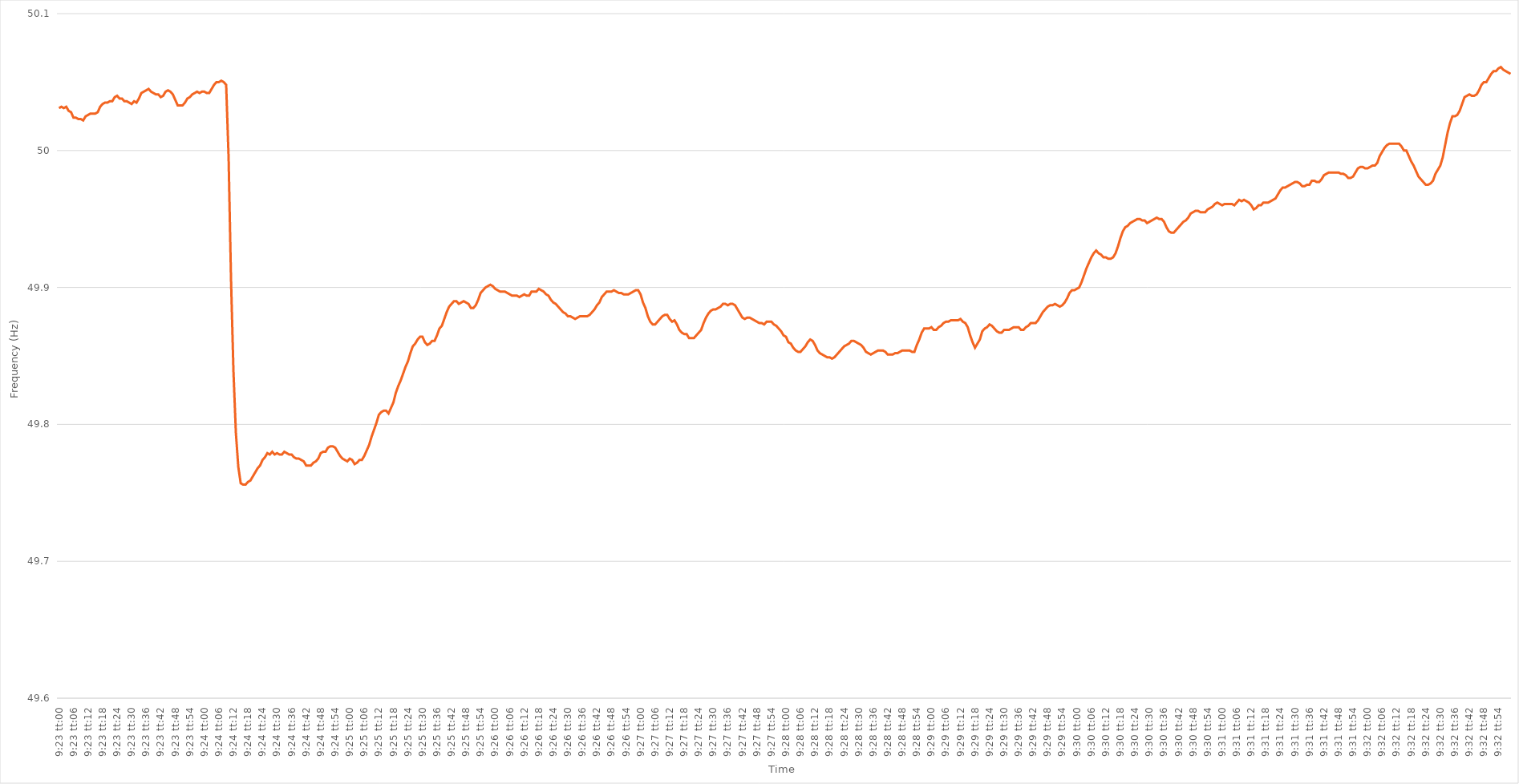
| Category | Series 0 |
|---|---|
| 0.3909722222222222 | 50.031 |
| 0.3909837962962963 | 50.032 |
| 0.39099537037037035 | 50.031 |
| 0.39100694444444445 | 50.032 |
| 0.3910185185185185 | 50.029 |
| 0.39103009259259264 | 50.028 |
| 0.3910416666666667 | 50.024 |
| 0.39105324074074077 | 50.024 |
| 0.3910648148148148 | 50.023 |
| 0.3910763888888889 | 50.023 |
| 0.39108796296296294 | 50.022 |
| 0.391099537037037 | 50.025 |
| 0.39111111111111113 | 50.026 |
| 0.39112268518518517 | 50.027 |
| 0.39113425925925926 | 50.027 |
| 0.3911458333333333 | 50.027 |
| 0.3911574074074074 | 50.028 |
| 0.39116898148148144 | 50.032 |
| 0.3911805555555556 | 50.034 |
| 0.3911921296296296 | 50.035 |
| 0.3912037037037037 | 50.035 |
| 0.39121527777777776 | 50.036 |
| 0.39122685185185185 | 50.036 |
| 0.3912384259259259 | 50.039 |
| 0.39125000000000004 | 50.04 |
| 0.3912615740740741 | 50.038 |
| 0.3912731481481482 | 50.038 |
| 0.3912847222222222 | 50.036 |
| 0.3912962962962963 | 50.036 |
| 0.39130787037037035 | 50.035 |
| 0.3913194444444445 | 50.034 |
| 0.39133101851851854 | 50.036 |
| 0.39134259259259263 | 50.035 |
| 0.39135416666666667 | 50.038 |
| 0.3913657407407407 | 50.042 |
| 0.3913773148148148 | 50.043 |
| 0.39138888888888884 | 50.044 |
| 0.391400462962963 | 50.045 |
| 0.39141203703703703 | 50.043 |
| 0.3914236111111111 | 50.042 |
| 0.39143518518518516 | 50.041 |
| 0.39144675925925926 | 50.041 |
| 0.3914583333333333 | 50.039 |
| 0.39146990740740745 | 50.04 |
| 0.3914814814814815 | 50.043 |
| 0.3914930555555556 | 50.044 |
| 0.3915046296296296 | 50.043 |
| 0.3915162037037037 | 50.041 |
| 0.39152777777777775 | 50.037 |
| 0.3915393518518519 | 50.033 |
| 0.39155092592592594 | 50.033 |
| 0.39156250000000004 | 50.033 |
| 0.3915740740740741 | 50.035 |
| 0.3915856481481481 | 50.038 |
| 0.3915972222222222 | 50.039 |
| 0.39160879629629625 | 50.041 |
| 0.3916203703703704 | 50.042 |
| 0.39163194444444444 | 50.043 |
| 0.39164351851851853 | 50.042 |
| 0.39165509259259257 | 50.043 |
| 0.39166666666666666 | 50.043 |
| 0.3916782407407407 | 50.042 |
| 0.39168981481481485 | 50.042 |
| 0.3917013888888889 | 50.045 |
| 0.391712962962963 | 50.048 |
| 0.391724537037037 | 50.05 |
| 0.3917361111111111 | 50.05 |
| 0.39174768518518516 | 50.051 |
| 0.3917592592592593 | 50.05 |
| 0.39177083333333335 | 50.048 |
| 0.39178240740740744 | 49.995 |
| 0.3917939814814815 | 49.906 |
| 0.3918055555555555 | 49.839 |
| 0.3918171296296296 | 49.794 |
| 0.39182870370370365 | 49.769 |
| 0.3918402777777778 | 49.757 |
| 0.39185185185185184 | 49.756 |
| 0.39186342592592593 | 49.756 |
| 0.391875 | 49.758 |
| 0.39188657407407407 | 49.759 |
| 0.3918981481481481 | 49.762 |
| 0.39190972222222226 | 49.765 |
| 0.3919212962962963 | 49.768 |
| 0.3919328703703704 | 49.77 |
| 0.39194444444444443 | 49.774 |
| 0.3919560185185185 | 49.776 |
| 0.39196759259259256 | 49.779 |
| 0.3919791666666667 | 49.778 |
| 0.39199074074074075 | 49.78 |
| 0.39200231481481485 | 49.778 |
| 0.3920138888888889 | 49.779 |
| 0.392025462962963 | 49.778 |
| 0.392037037037037 | 49.778 |
| 0.39204861111111117 | 49.78 |
| 0.3920601851851852 | 49.779 |
| 0.39207175925925924 | 49.778 |
| 0.39208333333333334 | 49.778 |
| 0.3920949074074074 | 49.776 |
| 0.3921064814814815 | 49.775 |
| 0.3921180555555555 | 49.775 |
| 0.39212962962962966 | 49.774 |
| 0.3921412037037037 | 49.773 |
| 0.3921527777777778 | 49.77 |
| 0.39216435185185183 | 49.77 |
| 0.39217592592592593 | 49.77 |
| 0.39218749999999997 | 49.772 |
| 0.3921990740740741 | 49.773 |
| 0.39221064814814816 | 49.775 |
| 0.39222222222222225 | 49.779 |
| 0.3922337962962963 | 49.78 |
| 0.3922453703703704 | 49.78 |
| 0.3922569444444444 | 49.783 |
| 0.39226851851851857 | 49.784 |
| 0.3922800925925926 | 49.784 |
| 0.39229166666666665 | 49.783 |
| 0.39230324074074074 | 49.78 |
| 0.3923148148148148 | 49.777 |
| 0.3923263888888889 | 49.775 |
| 0.3923379629629629 | 49.774 |
| 0.39234953703703707 | 49.773 |
| 0.3923611111111111 | 49.775 |
| 0.3923726851851852 | 49.774 |
| 0.39238425925925924 | 49.771 |
| 0.39239583333333333 | 49.772 |
| 0.39240740740740737 | 49.774 |
| 0.3924189814814815 | 49.774 |
| 0.39243055555555556 | 49.777 |
| 0.39244212962962965 | 49.781 |
| 0.3924537037037037 | 49.785 |
| 0.3924652777777778 | 49.791 |
| 0.3924768518518518 | 49.796 |
| 0.392488425925926 | 49.801 |
| 0.3925 | 49.807 |
| 0.39251157407407405 | 49.809 |
| 0.39252314814814815 | 49.81 |
| 0.3925347222222222 | 49.81 |
| 0.3925462962962963 | 49.808 |
| 0.3925578703703703 | 49.812 |
| 0.39256944444444447 | 49.816 |
| 0.3925810185185185 | 49.823 |
| 0.3925925925925926 | 49.828 |
| 0.39260416666666664 | 49.832 |
| 0.39261574074074074 | 49.837 |
| 0.3926273148148148 | 49.842 |
| 0.3926388888888889 | 49.846 |
| 0.39265046296296297 | 49.852 |
| 0.39266203703703706 | 49.857 |
| 0.3926736111111111 | 49.859 |
| 0.3926851851851852 | 49.862 |
| 0.39269675925925923 | 49.864 |
| 0.3927083333333334 | 49.864 |
| 0.3927199074074074 | 49.86 |
| 0.3927314814814815 | 49.858 |
| 0.39274305555555555 | 49.859 |
| 0.39275462962962965 | 49.861 |
| 0.3927662037037037 | 49.861 |
| 0.3927777777777777 | 49.865 |
| 0.3927893518518519 | 49.87 |
| 0.3928009259259259 | 49.872 |
| 0.3928125 | 49.877 |
| 0.39282407407407405 | 49.882 |
| 0.39283564814814814 | 49.886 |
| 0.3928472222222222 | 49.888 |
| 0.39285879629629633 | 49.89 |
| 0.39287037037037037 | 49.89 |
| 0.39288194444444446 | 49.888 |
| 0.3928935185185185 | 49.889 |
| 0.3929050925925926 | 49.89 |
| 0.39291666666666664 | 49.889 |
| 0.3929282407407408 | 49.888 |
| 0.3929398148148148 | 49.885 |
| 0.3929513888888889 | 49.885 |
| 0.39296296296296296 | 49.887 |
| 0.39297453703703705 | 49.891 |
| 0.3929861111111111 | 49.896 |
| 0.39299768518518513 | 49.898 |
| 0.3930092592592593 | 49.9 |
| 0.3930208333333333 | 49.901 |
| 0.3930324074074074 | 49.902 |
| 0.39304398148148145 | 49.901 |
| 0.39305555555555555 | 49.899 |
| 0.3930671296296296 | 49.898 |
| 0.39307870370370374 | 49.897 |
| 0.3930902777777778 | 49.897 |
| 0.39310185185185187 | 49.897 |
| 0.3931134259259259 | 49.896 |
| 0.393125 | 49.895 |
| 0.39313657407407404 | 49.894 |
| 0.3931481481481482 | 49.894 |
| 0.39315972222222223 | 49.894 |
| 0.3931712962962963 | 49.893 |
| 0.39318287037037036 | 49.894 |
| 0.39319444444444446 | 49.895 |
| 0.3932060185185185 | 49.894 |
| 0.39321759259259265 | 49.894 |
| 0.3932291666666667 | 49.897 |
| 0.3932407407407407 | 49.897 |
| 0.3932523148148148 | 49.897 |
| 0.39326388888888886 | 49.899 |
| 0.39327546296296295 | 49.898 |
| 0.393287037037037 | 49.897 |
| 0.39329861111111114 | 49.895 |
| 0.3933101851851852 | 49.894 |
| 0.3933217592592593 | 49.891 |
| 0.3933333333333333 | 49.889 |
| 0.3933449074074074 | 49.888 |
| 0.39335648148148145 | 49.886 |
| 0.3933680555555556 | 49.884 |
| 0.39337962962962963 | 49.882 |
| 0.39339120370370373 | 49.881 |
| 0.39340277777777777 | 49.879 |
| 0.39341435185185186 | 49.879 |
| 0.3934259259259259 | 49.878 |
| 0.39343750000000005 | 49.877 |
| 0.3934490740740741 | 49.878 |
| 0.3934606481481482 | 49.879 |
| 0.3934722222222222 | 49.879 |
| 0.39348379629629626 | 49.879 |
| 0.39349537037037036 | 49.879 |
| 0.3935069444444444 | 49.88 |
| 0.39351851851851855 | 49.882 |
| 0.3935300925925926 | 49.884 |
| 0.3935416666666667 | 49.887 |
| 0.3935532407407407 | 49.889 |
| 0.3935648148148148 | 49.893 |
| 0.39357638888888885 | 49.895 |
| 0.393587962962963 | 49.897 |
| 0.39359953703703704 | 49.897 |
| 0.39361111111111113 | 49.897 |
| 0.3936226851851852 | 49.898 |
| 0.39363425925925927 | 49.897 |
| 0.3936458333333333 | 49.896 |
| 0.39365740740740746 | 49.896 |
| 0.3936689814814815 | 49.895 |
| 0.3936805555555556 | 49.895 |
| 0.39369212962962963 | 49.895 |
| 0.39370370370370367 | 49.896 |
| 0.39371527777777776 | 49.897 |
| 0.3937268518518518 | 49.898 |
| 0.39373842592592595 | 49.898 |
| 0.39375 | 49.895 |
| 0.3937615740740741 | 49.889 |
| 0.3937731481481481 | 49.885 |
| 0.3937847222222222 | 49.879 |
| 0.39379629629629626 | 49.875 |
| 0.3938078703703704 | 49.873 |
| 0.39381944444444444 | 49.873 |
| 0.39383101851851854 | 49.875 |
| 0.3938425925925926 | 49.877 |
| 0.39385416666666667 | 49.879 |
| 0.3938657407407407 | 49.88 |
| 0.39387731481481486 | 49.88 |
| 0.3938888888888889 | 49.877 |
| 0.393900462962963 | 49.875 |
| 0.39391203703703703 | 49.876 |
| 0.3939236111111111 | 49.873 |
| 0.39393518518518517 | 49.869 |
| 0.3939467592592593 | 49.867 |
| 0.39395833333333335 | 49.866 |
| 0.3939699074074074 | 49.866 |
| 0.3939814814814815 | 49.863 |
| 0.3939930555555555 | 49.863 |
| 0.3940046296296296 | 49.863 |
| 0.39401620370370366 | 49.865 |
| 0.3940277777777778 | 49.867 |
| 0.39403935185185185 | 49.869 |
| 0.39405092592592594 | 49.874 |
| 0.3940625 | 49.878 |
| 0.3940740740740741 | 49.881 |
| 0.3940856481481481 | 49.883 |
| 0.39409722222222227 | 49.884 |
| 0.3941087962962963 | 49.884 |
| 0.3941203703703704 | 49.885 |
| 0.39413194444444444 | 49.886 |
| 0.39414351851851853 | 49.888 |
| 0.39415509259259257 | 49.888 |
| 0.3941666666666667 | 49.887 |
| 0.39417824074074076 | 49.888 |
| 0.3941898148148148 | 49.888 |
| 0.3942013888888889 | 49.887 |
| 0.39421296296296293 | 49.884 |
| 0.394224537037037 | 49.881 |
| 0.39423611111111106 | 49.878 |
| 0.3942476851851852 | 49.877 |
| 0.39425925925925925 | 49.878 |
| 0.39427083333333335 | 49.878 |
| 0.3942824074074074 | 49.877 |
| 0.3942939814814815 | 49.876 |
| 0.3943055555555555 | 49.875 |
| 0.39431712962962967 | 49.874 |
| 0.3943287037037037 | 49.874 |
| 0.3943402777777778 | 49.873 |
| 0.39435185185185184 | 49.875 |
| 0.39436342592592594 | 49.875 |
| 0.394375 | 49.875 |
| 0.3943865740740741 | 49.873 |
| 0.39439814814814816 | 49.872 |
| 0.3944097222222222 | 49.87 |
| 0.3944212962962963 | 49.868 |
| 0.39443287037037034 | 49.865 |
| 0.39444444444444443 | 49.864 |
| 0.39445601851851847 | 49.86 |
| 0.3944675925925926 | 49.859 |
| 0.39447916666666666 | 49.856 |
| 0.39449074074074075 | 49.854 |
| 0.3945023148148148 | 49.853 |
| 0.3945138888888889 | 49.853 |
| 0.3945254629629629 | 49.855 |
| 0.3945370370370371 | 49.857 |
| 0.3945486111111111 | 49.86 |
| 0.3945601851851852 | 49.862 |
| 0.39457175925925925 | 49.861 |
| 0.39458333333333334 | 49.858 |
| 0.3945949074074074 | 49.854 |
| 0.39460648148148153 | 49.852 |
| 0.39461805555555557 | 49.851 |
| 0.39462962962962966 | 49.85 |
| 0.3946412037037037 | 49.849 |
| 0.3946527777777778 | 49.849 |
| 0.39466435185185184 | 49.848 |
| 0.3946759259259259 | 49.849 |
| 0.3946875 | 49.851 |
| 0.39469907407407406 | 49.853 |
| 0.39471064814814816 | 49.855 |
| 0.3947222222222222 | 49.857 |
| 0.3947337962962963 | 49.858 |
| 0.39474537037037033 | 49.859 |
| 0.3947569444444445 | 49.861 |
| 0.3947685185185185 | 49.861 |
| 0.3947800925925926 | 49.86 |
| 0.39479166666666665 | 49.859 |
| 0.39480324074074075 | 49.858 |
| 0.3948148148148148 | 49.856 |
| 0.39482638888888894 | 49.853 |
| 0.394837962962963 | 49.852 |
| 0.39484953703703707 | 49.851 |
| 0.3948611111111111 | 49.852 |
| 0.3948726851851852 | 49.853 |
| 0.39488425925925924 | 49.854 |
| 0.3948958333333333 | 49.854 |
| 0.39490740740740743 | 49.854 |
| 0.39491898148148147 | 49.853 |
| 0.39493055555555556 | 49.851 |
| 0.3949421296296296 | 49.851 |
| 0.3949537037037037 | 49.851 |
| 0.39496527777777773 | 49.852 |
| 0.3949768518518519 | 49.852 |
| 0.3949884259259259 | 49.853 |
| 0.395 | 49.854 |
| 0.39501157407407406 | 49.854 |
| 0.39502314814814815 | 49.854 |
| 0.3950347222222222 | 49.854 |
| 0.39504629629629634 | 49.853 |
| 0.3950578703703704 | 49.853 |
| 0.3950694444444445 | 49.858 |
| 0.3950810185185185 | 49.862 |
| 0.3950925925925926 | 49.867 |
| 0.39510416666666665 | 49.87 |
| 0.3951157407407407 | 49.87 |
| 0.39512731481481483 | 49.87 |
| 0.3951388888888889 | 49.871 |
| 0.39515046296296297 | 49.869 |
| 0.395162037037037 | 49.869 |
| 0.3951736111111111 | 49.871 |
| 0.39518518518518514 | 49.872 |
| 0.3951967592592593 | 49.874 |
| 0.39520833333333333 | 49.875 |
| 0.3952199074074074 | 49.875 |
| 0.39523148148148146 | 49.876 |
| 0.39524305555555556 | 49.876 |
| 0.3952546296296296 | 49.876 |
| 0.39526620370370374 | 49.876 |
| 0.3952777777777778 | 49.877 |
| 0.3952893518518519 | 49.875 |
| 0.3953009259259259 | 49.874 |
| 0.3953125 | 49.871 |
| 0.39532407407407405 | 49.865 |
| 0.3953356481481482 | 49.86 |
| 0.39534722222222224 | 49.856 |
| 0.39535879629629633 | 49.859 |
| 0.39537037037037037 | 49.862 |
| 0.3953819444444444 | 49.868 |
| 0.3953935185185185 | 49.87 |
| 0.39540509259259254 | 49.871 |
| 0.3954166666666667 | 49.873 |
| 0.39542824074074073 | 49.872 |
| 0.3954398148148148 | 49.87 |
| 0.39545138888888887 | 49.868 |
| 0.39546296296296296 | 49.867 |
| 0.395474537037037 | 49.867 |
| 0.39548611111111115 | 49.869 |
| 0.3954976851851852 | 49.869 |
| 0.3955092592592593 | 49.869 |
| 0.3955208333333333 | 49.87 |
| 0.3955324074074074 | 49.871 |
| 0.39554398148148145 | 49.871 |
| 0.3955555555555556 | 49.871 |
| 0.39556712962962964 | 49.869 |
| 0.39557870370370374 | 49.869 |
| 0.3955902777777778 | 49.871 |
| 0.3956018518518518 | 49.872 |
| 0.3956134259259259 | 49.874 |
| 0.39562499999999995 | 49.874 |
| 0.3956365740740741 | 49.874 |
| 0.39564814814814814 | 49.876 |
| 0.39565972222222223 | 49.879 |
| 0.39567129629629627 | 49.882 |
| 0.39568287037037037 | 49.884 |
| 0.3956944444444444 | 49.886 |
| 0.39570601851851855 | 49.887 |
| 0.3957175925925926 | 49.887 |
| 0.3957291666666667 | 49.888 |
| 0.3957407407407407 | 49.887 |
| 0.3957523148148148 | 49.886 |
| 0.39576388888888886 | 49.887 |
| 0.395775462962963 | 49.889 |
| 0.39578703703703705 | 49.892 |
| 0.39579861111111114 | 49.896 |
| 0.3958101851851852 | 49.898 |
| 0.3958217592592593 | 49.898 |
| 0.3958333333333333 | 49.899 |
| 0.39584490740740735 | 49.9 |
| 0.3958564814814815 | 49.904 |
| 0.39586805555555554 | 49.909 |
| 0.39587962962962964 | 49.914 |
| 0.3958912037037037 | 49.918 |
| 0.39590277777777777 | 49.922 |
| 0.3959143518518518 | 49.925 |
| 0.39592592592592596 | 49.927 |
| 0.3959375 | 49.925 |
| 0.3959490740740741 | 49.924 |
| 0.39596064814814813 | 49.922 |
| 0.3959722222222222 | 49.922 |
| 0.39598379629629626 | 49.921 |
| 0.3959953703703704 | 49.921 |
| 0.39600694444444445 | 49.922 |
| 0.39601851851851855 | 49.925 |
| 0.3960300925925926 | 49.93 |
| 0.3960416666666667 | 49.936 |
| 0.3960532407407407 | 49.941 |
| 0.39606481481481487 | 49.944 |
| 0.3960763888888889 | 49.945 |
| 0.39608796296296295 | 49.947 |
| 0.39609953703703704 | 49.948 |
| 0.3961111111111111 | 49.949 |
| 0.3961226851851852 | 49.95 |
| 0.3961342592592592 | 49.95 |
| 0.39614583333333336 | 49.949 |
| 0.3961574074074074 | 49.949 |
| 0.3961689814814815 | 49.947 |
| 0.39618055555555554 | 49.948 |
| 0.39619212962962963 | 49.949 |
| 0.39620370370370367 | 49.95 |
| 0.3962152777777778 | 49.951 |
| 0.39622685185185186 | 49.95 |
| 0.39623842592592595 | 49.95 |
| 0.39625 | 49.948 |
| 0.3962615740740741 | 49.944 |
| 0.3962731481481481 | 49.941 |
| 0.3962847222222223 | 49.94 |
| 0.3962962962962963 | 49.94 |
| 0.39630787037037035 | 49.942 |
| 0.39631944444444445 | 49.944 |
| 0.3963310185185185 | 49.946 |
| 0.3963425925925926 | 49.948 |
| 0.3963541666666666 | 49.949 |
| 0.39636574074074077 | 49.951 |
| 0.3963773148148148 | 49.954 |
| 0.3963888888888889 | 49.955 |
| 0.39640046296296294 | 49.956 |
| 0.39641203703703703 | 49.956 |
| 0.3964236111111111 | 49.955 |
| 0.3964351851851852 | 49.955 |
| 0.39644675925925926 | 49.955 |
| 0.39645833333333336 | 49.957 |
| 0.3964699074074074 | 49.958 |
| 0.3964814814814815 | 49.959 |
| 0.39649305555555553 | 49.961 |
| 0.3965046296296297 | 49.962 |
| 0.3965162037037037 | 49.961 |
| 0.3965277777777778 | 49.96 |
| 0.39653935185185185 | 49.961 |
| 0.39655092592592595 | 49.961 |
| 0.3965625 | 49.961 |
| 0.396574074074074 | 49.961 |
| 0.3965856481481482 | 49.96 |
| 0.3965972222222222 | 49.962 |
| 0.3966087962962963 | 49.964 |
| 0.39662037037037035 | 49.963 |
| 0.39663194444444444 | 49.964 |
| 0.3966435185185185 | 49.963 |
| 0.39665509259259263 | 49.962 |
| 0.39666666666666667 | 49.96 |
| 0.39667824074074076 | 49.957 |
| 0.3966898148148148 | 49.958 |
| 0.3967013888888889 | 49.96 |
| 0.39671296296296293 | 49.96 |
| 0.3967245370370371 | 49.962 |
| 0.3967361111111111 | 49.962 |
| 0.3967476851851852 | 49.962 |
| 0.39675925925925926 | 49.963 |
| 0.39677083333333335 | 49.964 |
| 0.3967824074074074 | 49.965 |
| 0.39679398148148143 | 49.968 |
| 0.3968055555555556 | 49.971 |
| 0.3968171296296296 | 49.973 |
| 0.3968287037037037 | 49.973 |
| 0.39684027777777775 | 49.974 |
| 0.39685185185185184 | 49.975 |
| 0.3968634259259259 | 49.976 |
| 0.39687500000000003 | 49.977 |
| 0.39688657407407407 | 49.977 |
| 0.39689814814814817 | 49.976 |
| 0.3969097222222222 | 49.974 |
| 0.3969212962962963 | 49.974 |
| 0.39693287037037034 | 49.975 |
| 0.3969444444444445 | 49.975 |
| 0.3969560185185185 | 49.978 |
| 0.3969675925925926 | 49.978 |
| 0.39697916666666666 | 49.977 |
| 0.39699074074074076 | 49.977 |
| 0.3970023148148148 | 49.979 |
| 0.39701388888888883 | 49.982 |
| 0.397025462962963 | 49.983 |
| 0.397037037037037 | 49.984 |
| 0.3970486111111111 | 49.984 |
| 0.39706018518518515 | 49.984 |
| 0.39707175925925925 | 49.984 |
| 0.3970833333333333 | 49.984 |
| 0.39709490740740744 | 49.983 |
| 0.3971064814814815 | 49.983 |
| 0.39711805555555557 | 49.982 |
| 0.3971296296296296 | 49.98 |
| 0.3971412037037037 | 49.98 |
| 0.39715277777777774 | 49.981 |
| 0.3971643518518519 | 49.984 |
| 0.39717592592592593 | 49.987 |
| 0.3971875 | 49.988 |
| 0.39719907407407407 | 49.988 |
| 0.39721064814814816 | 49.987 |
| 0.3972222222222222 | 49.987 |
| 0.39723379629629635 | 49.988 |
| 0.3972453703703704 | 49.989 |
| 0.3972569444444444 | 49.989 |
| 0.3972685185185185 | 49.991 |
| 0.39728009259259256 | 49.996 |
| 0.39729166666666665 | 49.999 |
| 0.3973032407407407 | 50.002 |
| 0.39731481481481484 | 50.004 |
| 0.3973263888888889 | 50.005 |
| 0.397337962962963 | 50.005 |
| 0.397349537037037 | 50.005 |
| 0.3973611111111111 | 50.005 |
| 0.39737268518518515 | 50.005 |
| 0.3973842592592593 | 50.003 |
| 0.39739583333333334 | 50 |
| 0.39740740740740743 | 50 |
| 0.39741898148148147 | 49.996 |
| 0.39743055555555556 | 49.992 |
| 0.3974421296296296 | 49.989 |
| 0.39745370370370375 | 49.985 |
| 0.3974652777777778 | 49.981 |
| 0.3974768518518519 | 49.979 |
| 0.3974884259259259 | 49.977 |
| 0.39749999999999996 | 49.975 |
| 0.39751157407407406 | 49.975 |
| 0.3975231481481481 | 49.976 |
| 0.39753472222222225 | 49.978 |
| 0.3975462962962963 | 49.983 |
| 0.3975578703703704 | 49.986 |
| 0.3975694444444444 | 49.989 |
| 0.3975810185185185 | 49.995 |
| 0.39759259259259255 | 50.004 |
| 0.3976041666666667 | 50.013 |
| 0.39761574074074074 | 50.02 |
| 0.39762731481481484 | 50.025 |
| 0.3976388888888889 | 50.025 |
| 0.39765046296296297 | 50.026 |
| 0.397662037037037 | 50.029 |
| 0.39767361111111116 | 50.034 |
| 0.3976851851851852 | 50.039 |
| 0.3976967592592593 | 50.04 |
| 0.39770833333333333 | 50.041 |
| 0.3977199074074074 | 50.04 |
| 0.39773148148148146 | 50.04 |
| 0.3977430555555555 | 50.041 |
| 0.39775462962962965 | 50.044 |
| 0.3977662037037037 | 50.048 |
| 0.3977777777777778 | 50.05 |
| 0.3977893518518518 | 50.05 |
| 0.3978009259259259 | 50.053 |
| 0.39781249999999996 | 50.056 |
| 0.3978240740740741 | 50.058 |
| 0.39783564814814815 | 50.058 |
| 0.39784722222222224 | 50.06 |
| 0.3978587962962963 | 50.061 |
| 0.3978703703703704 | 50.059 |
| 0.3978819444444444 | 50.058 |
| 0.39789351851851856 | 50.057 |
| 0.3979050925925926 | 50.056 |